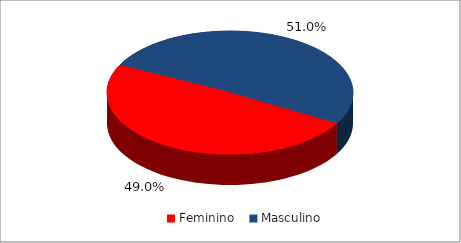
| Category | N |
|---|---|
| Feminino | 48 |
| Masculino | 50 |